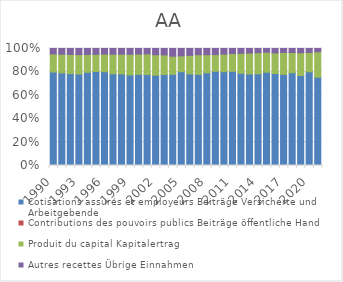
| Category | Cotisations assurés et employeurs | Contributions des pouvoirs publics | Produit du capital | Autres recettes |
|---|---|---|---|---|
| 1990.0 | 0.799 | 0 | 0.155 | 0.046 |
| 1991.0 | 0.791 | 0 | 0.16 | 0.049 |
| 1992.0 | 0.785 | 0 | 0.164 | 0.051 |
| 1993.0 | 0.782 | 0 | 0.166 | 0.052 |
| 1994.0 | 0.797 | 0 | 0.152 | 0.051 |
| 1995.0 | 0.804 | 0 | 0.147 | 0.05 |
| 1996.0 | 0.802 | 0 | 0.151 | 0.048 |
| 1997.0 | 0.784 | 0 | 0.167 | 0.049 |
| 1998.0 | 0.782 | 0 | 0.169 | 0.048 |
| 1999.0 | 0.774 | 0 | 0.177 | 0.049 |
| 2000.0 | 0.78 | 0 | 0.173 | 0.047 |
| 2001.0 | 0.777 | 0 | 0.177 | 0.046 |
| 2002.0 | 0.771 | 0 | 0.175 | 0.053 |
| 2003.0 | 0.777 | 0 | 0.168 | 0.055 |
| 2004.0 | 0.779 | 0 | 0.155 | 0.066 |
| 2005.0 | 0.802 | 0 | 0.135 | 0.063 |
| 2006.0 | 0.783 | 0 | 0.158 | 0.059 |
| 2007.0 | 0.778 | 0 | 0.169 | 0.053 |
| 2008.0 | 0.792 | 0 | 0.155 | 0.053 |
| 2009.0 | 0.806 | 0 | 0.142 | 0.052 |
| 2010.0 | 0.802 | 0 | 0.151 | 0.048 |
| 2011.0 | 0.805 | 0 | 0.152 | 0.043 |
| 2012.0 | 0.788 | 0 | 0.171 | 0.041 |
| 2013.0 | 0.783 | 0 | 0.178 | 0.039 |
| 2014.0 | 0.783 | 0 | 0.181 | 0.036 |
| 2015.0 | 0.797 | 0 | 0.171 | 0.032 |
| 2016.0 | 0.786 | 0 | 0.176 | 0.038 |
| 2017.0 | 0.779 | 0 | 0.187 | 0.034 |
| 2018.0 | 0.793 | 0 | 0.173 | 0.035 |
| 2019.0 | 0.769 | 0 | 0.195 | 0.036 |
| 2020.0 | 0.801 | 0 | 0.166 | 0.033 |
| 2021.0 | 0.755 | 0 | 0.217 | 0.028 |